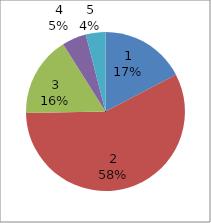
| Category | Series 0 |
|---|---|
| 0 | 407 |
| 1 | 1348 |
| 2 | 384 |
| 3 | 116 |
| 4 | 94 |